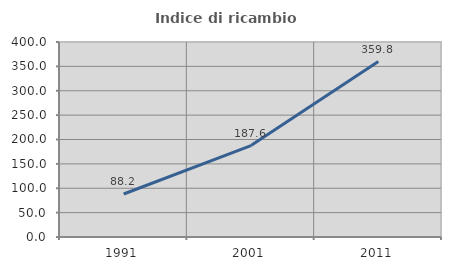
| Category | Indice di ricambio occupazionale  |
|---|---|
| 1991.0 | 88.211 |
| 2001.0 | 187.634 |
| 2011.0 | 359.809 |